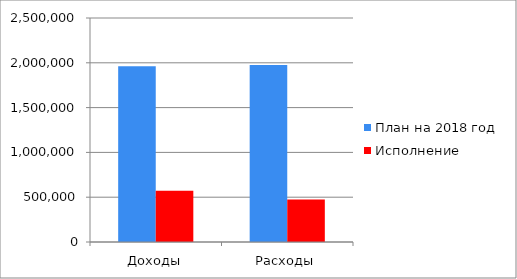
| Category | План на 2018 год | Исполнение |
|---|---|---|
| Доходы | 1961458 | 572641 |
| Расходы | 1974987 | 473853 |